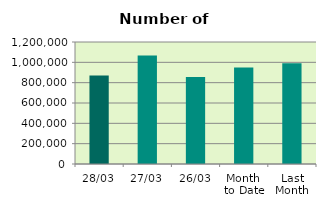
| Category | Series 0 |
|---|---|
| 28/03 | 869786 |
| 27/03 | 1066904 |
| 26/03 | 856824 |
| Month 
to Date | 948694.5 |
| Last
Month | 989849.1 |